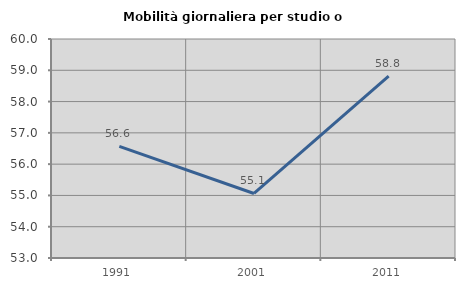
| Category | Mobilità giornaliera per studio o lavoro |
|---|---|
| 1991.0 | 56.566 |
| 2001.0 | 55.062 |
| 2011.0 | 58.816 |